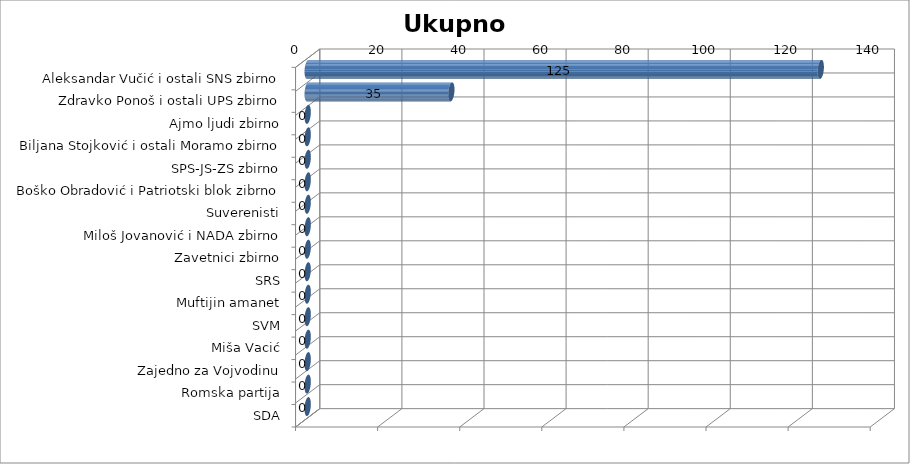
| Category | Ukupno glavna |
|---|---|
| Aleksandar Vučić i ostali SNS zbirno | 125 |
| Zdravko Ponoš i ostali UPS zbirno | 35 |
| Ajmo ljudi zbirno | 0 |
| Biljana Stojković i ostali Moramo zbirno | 0 |
| SPS-JS-ZS zbirno | 0 |
| Boško Obradović i Patriotski blok zibrno | 0 |
| Suverenisti | 0 |
| Miloš Jovanović i NADA zbirno | 0 |
| Zavetnici zbirno | 0 |
| SRS | 0 |
| Muftijin amanet | 0 |
| SVM | 0 |
| Miša Vacić | 0 |
| Zajedno za Vojvodinu | 0 |
| Romska partija | 0 |
| SDA | 0 |